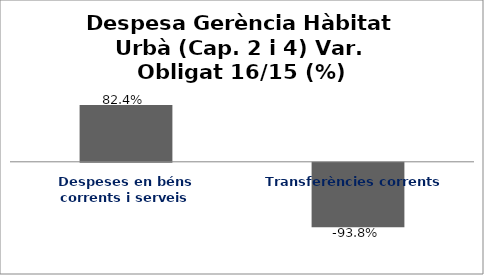
| Category | Series 0 |
|---|---|
| Despeses en béns corrents i serveis | 0.824 |
| Transferències corrents | -0.938 |